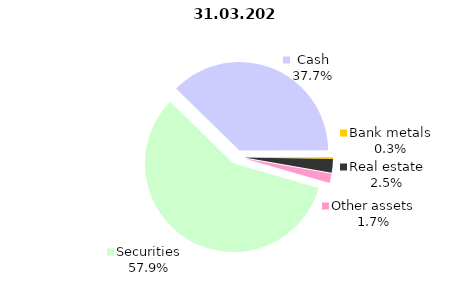
| Category | 03.31.2021 |
|---|---|
| Securities | 2106.2 |
| Cash | 1370.49 |
| Bank metals | 10.485 |
| Real estate | 90.355 |
| Other assets | 62.073 |